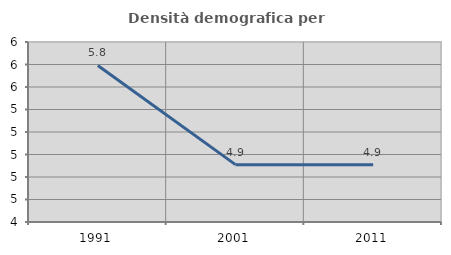
| Category | Densità demografica |
|---|---|
| 1991.0 | 5.791 |
| 2001.0 | 4.91 |
| 2011.0 | 4.91 |